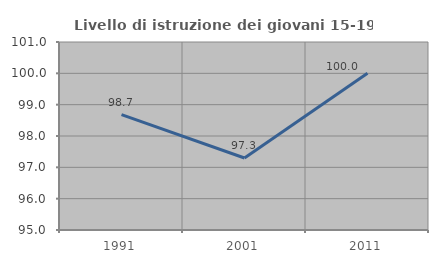
| Category | Livello di istruzione dei giovani 15-19 anni |
|---|---|
| 1991.0 | 98.684 |
| 2001.0 | 97.297 |
| 2011.0 | 100 |